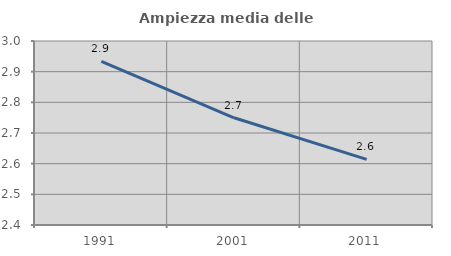
| Category | Ampiezza media delle famiglie |
|---|---|
| 1991.0 | 2.934 |
| 2001.0 | 2.75 |
| 2011.0 | 2.614 |